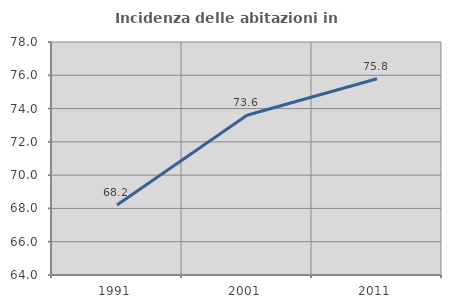
| Category | Incidenza delle abitazioni in proprietà  |
|---|---|
| 1991.0 | 68.2 |
| 2001.0 | 73.596 |
| 2011.0 | 75.791 |